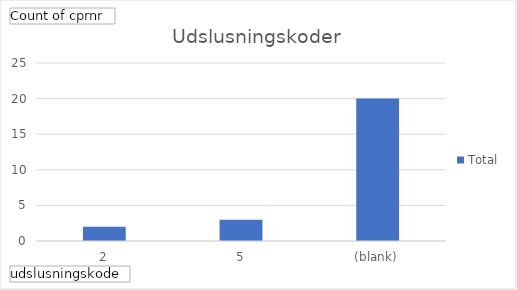
| Category | Total |
|---|---|
| 2 | 2 |
| 5 | 3 |
| (blank) | 20 |